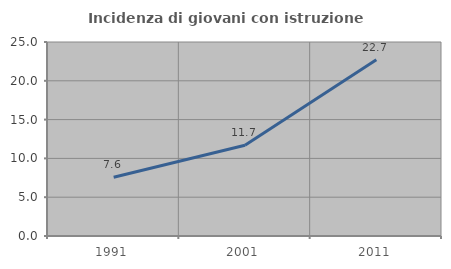
| Category | Incidenza di giovani con istruzione universitaria |
|---|---|
| 1991.0 | 7.576 |
| 2001.0 | 11.702 |
| 2011.0 | 22.727 |